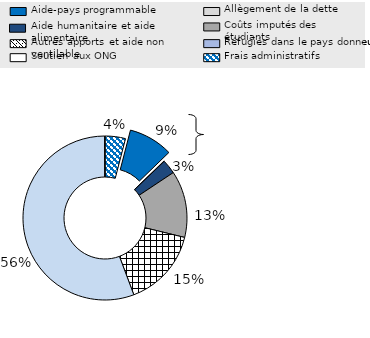
| Category | Series 0 |
|---|---|
| Frais administratifs  | 0.04 |
| Aide-pays programmable | 0.087 |
| Allègement de la dette | 0.001 |
| Aide humanitaire et aide alimentaire | 0.028 |
| Coûts imputés des étudiants | 0.131 |
| Autres apports et aide non ventilable | 0.155 |
| Réfugiés dans le pays donneur | 0.556 |
| Soutien aux ONG | 0.001 |